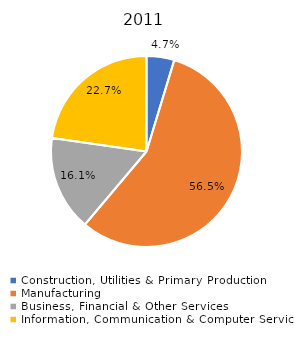
| Category | Series 0 |
|---|---|
| Construction, Utilities & Primary Production  | 0.047 |
| Manufacturing  | 0.565 |
| Business, Financial & Other Services | 0.161 |
| Information, Communication & Computer Services | 0.227 |